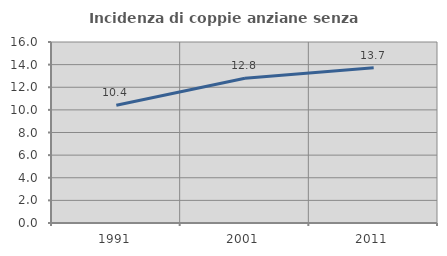
| Category | Incidenza di coppie anziane senza figli  |
|---|---|
| 1991.0 | 10.415 |
| 2001.0 | 12.802 |
| 2011.0 | 13.723 |